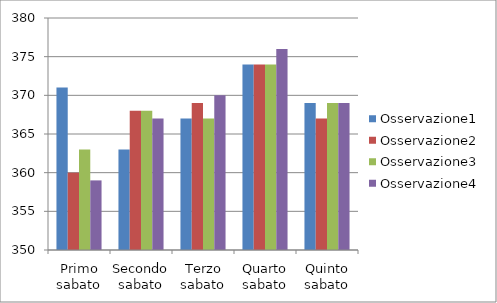
| Category | Osservazione1 | Osservazione2 | Osservazione3 | Osservazione4 |
|---|---|---|---|---|
| Primo sabato | 371 | 360 | 363 | 359 |
| Secondo sabato | 363 | 368 | 368 | 367 |
| Terzo sabato | 367 | 369 | 367 | 370 |
| Quarto sabato | 374 | 374 | 374 | 376 |
| Quinto sabato | 369 | 367 | 369 | 369 |